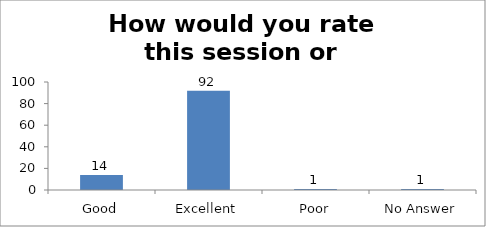
| Category | How would you rate this session or workshop? |
|---|---|
| Good | 14 |
| Excellent | 92 |
| Poor | 1 |
| No Answer | 1 |